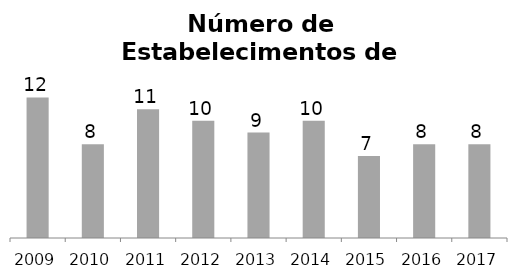
| Category | Transporte Aquaviário |
|---|---|
| 2009.0 | 12 |
| 2010.0 | 8 |
| 2011.0 | 11 |
| 2012.0 | 10 |
| 2013.0 | 9 |
| 2014.0 | 10 |
| 2015.0 | 7 |
| 2016.0 | 8 |
| 2017.0 | 8 |